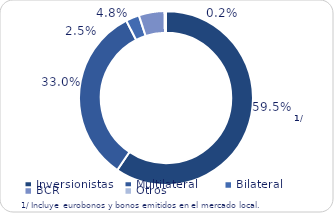
| Category | Series 0 |
|---|---|
| Inversionistas | 8748.1 |
| Multilateral | 4852.2 |
| Bilateral | 368.5 |
| BCR | 704.3 |
| Otros | 38.1 |